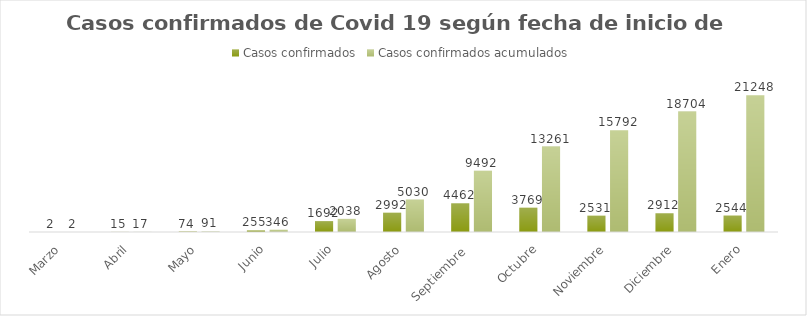
| Category | Casos confirmados | Casos confirmados acumulados |
|---|---|---|
| Marzo | 2 | 2 |
| Abril | 15 | 17 |
| Mayo | 74 | 91 |
| Junio | 255 | 346 |
| Julio | 1692 | 2038 |
| Agosto | 2992 | 5030 |
| Septiembre  | 4462 | 9492 |
| Octubre | 3769 | 13261 |
| Noviembre | 2531 | 15792 |
| Diciembre | 2912 | 18704 |
| Enero | 2544 | 21248 |